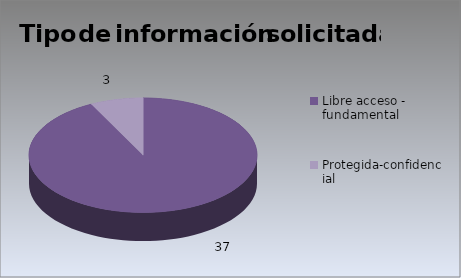
| Category | Series 0 |
|---|---|
| Libre acceso - fundamental | 37 |
| Protegida-confidencial | 3 |